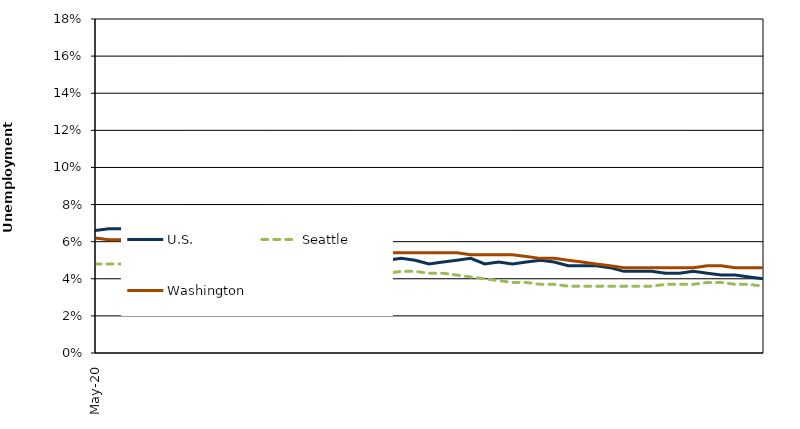
| Category | U.S. | Seattle | Washington |
|---|---|---|---|
| 2020-05-01 | 0.066 | 0.048 | 0.062 |
| 2020-06-01 | 0.067 | 0.048 | 0.061 |
| 2020-07-01 | 0.067 | 0.048 | 0.061 |
| 2020-08-01 | 0.062 | 0.048 | 0.06 |
| 2020-09-01 | 0.063 | 0.048 | 0.06 |
| 2020-10-01 | 0.061 | 0.048 | 0.059 |
| 2020-11-01 | 0.062 | 0.047 | 0.059 |
| 2020-12-01 | 0.061 | 0.046 | 0.059 |
| 2021-01-01 | 0.059 | 0.045 | 0.058 |
| 2021-02-01 | 0.057 | 0.044 | 0.058 |
| 2021-03-01 | 0.058 | 0.043 | 0.057 |
| 2021-04-01 | 0.056 | 0.042 | 0.057 |
| 2021-05-01 | 0.057 | 0.042 | 0.056 |
| 2021-06-01 | 0.055 | 0.042 | 0.055 |
| 2021-07-01 | 0.054 | 0.042 | 0.055 |
| 2021-08-01 | 0.054 | 0.042 | 0.054 |
| 2021-09-01 | 0.056 | 0.041 | 0.054 |
| 2021-10-01 | 0.053 | 0.041 | 0.054 |
| 2021-11-01 | 0.052 | 0.041 | 0.054 |
| 2021-12-01 | 0.051 | 0.042 | 0.054 |
| 2022-01-01 | 0.05 | 0.043 | 0.054 |
| 2022-02-01 | 0.05 | 0.043 | 0.054 |
| 2022-03-01 | 0.051 | 0.044 | 0.054 |
| 2022-04-01 | 0.05 | 0.044 | 0.054 |
| 2022-05-01 | 0.048 | 0.043 | 0.054 |
| 2022-06-01 | 0.049 | 0.043 | 0.054 |
| 2022-07-01 | 0.05 | 0.042 | 0.054 |
| 2022-08-01 | 0.051 | 0.041 | 0.053 |
| 2022-09-01 | 0.048 | 0.04 | 0.053 |
| 2022-10-01 | 0.049 | 0.039 | 0.053 |
| 2022-11-01 | 0.048 | 0.038 | 0.053 |
| 2022-12-01 | 0.049 | 0.038 | 0.052 |
| 2023-01-01 | 0.05 | 0.037 | 0.051 |
| 2023-02-01 | 0.049 | 0.037 | 0.051 |
| 2023-03-01 | 0.047 | 0.036 | 0.05 |
| 2023-04-01 | 0.047 | 0.036 | 0.049 |
| 2023-05-01 | 0.047 | 0.036 | 0.048 |
| 2023-06-01 | 0.046 | 0.036 | 0.047 |
| 2023-07-01 | 0.044 | 0.036 | 0.046 |
| 2023-08-01 | 0.044 | 0.036 | 0.046 |
| 2023-09-01 | 0.044 | 0.036 | 0.046 |
| 2023-10-01 | 0.043 | 0.037 | 0.046 |
| 2023-11-01 | 0.043 | 0.037 | 0.046 |
| 2023-12-01 | 0.044 | 0.037 | 0.046 |
| 2024-01-01 | 0.043 | 0.038 | 0.047 |
| 2024-02-01 | 0.042 | 0.038 | 0.047 |
| 2024-03-01 | 0.042 | 0.037 | 0.046 |
| 2024-04-01 | 0.041 | 0.037 | 0.046 |
| 2024-05-01 | 0.04 | 0.036 | 0.046 |